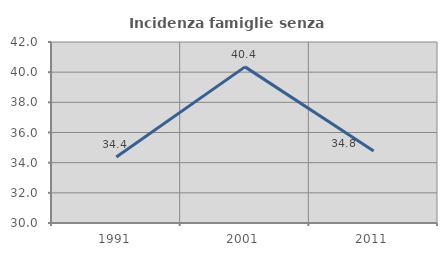
| Category | Incidenza famiglie senza nuclei |
|---|---|
| 1991.0 | 34.37 |
| 2001.0 | 40.351 |
| 2011.0 | 34.774 |